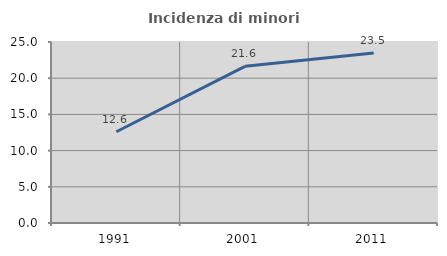
| Category | Incidenza di minori stranieri |
|---|---|
| 1991.0 | 12.605 |
| 2001.0 | 21.638 |
| 2011.0 | 23.481 |